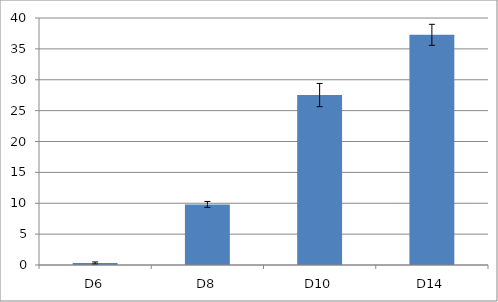
| Category | Series 0 |
|---|---|
| _x0002_D6 | 0.316 |
| _x0002_D8 | 9.813 |
| _x0003_D10 | 27.522 |
| _x0003_D14 | 37.275 |